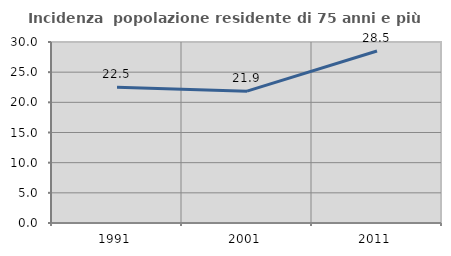
| Category | Incidenza  popolazione residente di 75 anni e più |
|---|---|
| 1991.0 | 22.484 |
| 2001.0 | 21.854 |
| 2011.0 | 28.502 |